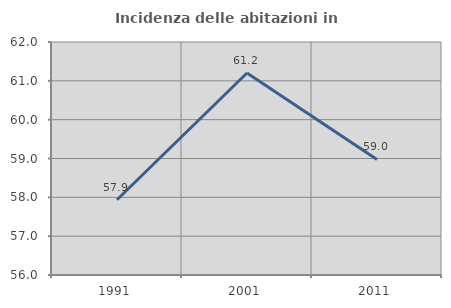
| Category | Incidenza delle abitazioni in proprietà  |
|---|---|
| 1991.0 | 57.938 |
| 2001.0 | 61.203 |
| 2011.0 | 58.976 |